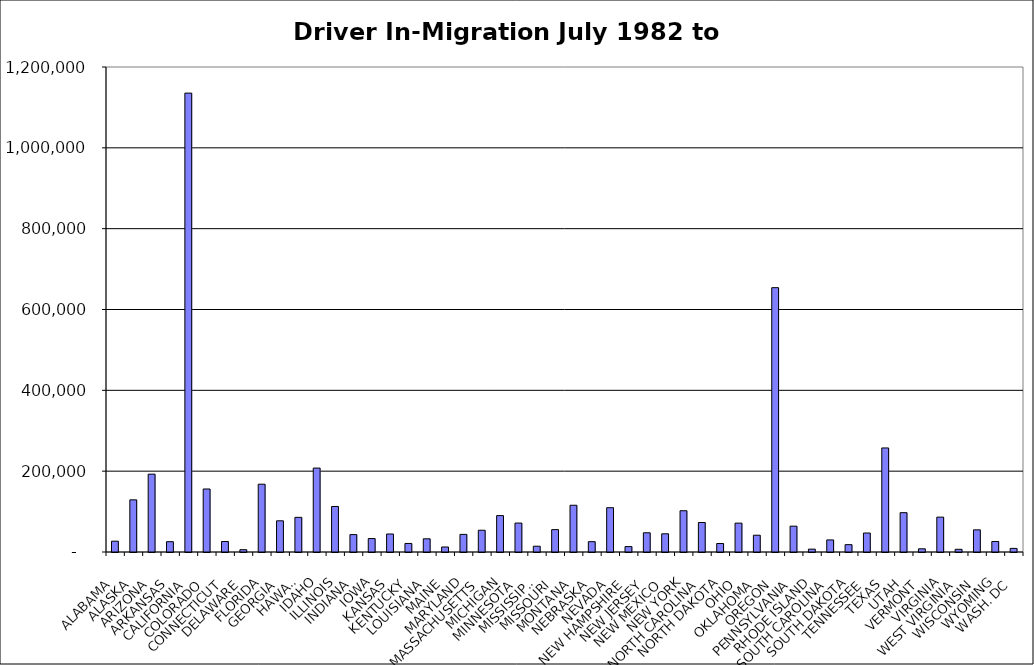
| Category | Series 0 |
|---|---|
| ALABAMA | 26725.5 |
| ALASKA | 129039.5 |
| ARIZONA | 192633 |
| ARKANSAS | 25525.5 |
| CALIFORNIA | 1135375.5 |
| COLORADO | 155894 |
| CONNECTICUT | 25974 |
| DELAWARE | 5707.5 |
| FLORIDA | 167730 |
| GEORGIA | 77190 |
| HAWAII | 85713.5 |
| IDAHO | 207676.5 |
| ILLINOIS | 112683.5 |
| INDIANA | 43066 |
| IOWA | 33222.5 |
| KANSAS | 44506.5 |
| KENTUCKY | 21128 |
| LOUISIANA | 32654.5 |
| MAINE | 12395.5 |
| MARYLAND | 43606 |
| MASSACHUSETTS | 53827 |
| MICHIGAN | 90055 |
| MINNESOTA | 71593.5 |
| MISSISSIPPI | 14270 |
| MISSOURI | 55364 |
| MONTANA | 115655 |
| NEBRASKA | 25555.5 |
| NEVADA | 109608 |
| NEW HAMPSHIRE | 13390.5 |
| NEW JERSEY | 47586 |
| NEW MEXICO | 45037 |
| NEW YORK | 102081 |
| NORTH CAROLINA | 72987.5 |
| NORTH DAKOTA | 21050.5 |
| OHIO | 71406.5 |
| OKLAHOMA | 41517 |
| OREGON | 654032 |
| PENNSYLVANIA | 63910.5 |
| RHODE ISLAND | 7075 |
| SOUTH CAROLINA | 29873.5 |
| SOUTH DAKOTA | 18203.5 |
| TENNESSEE | 46954.5 |
| TEXAS | 257466 |
| UTAH | 97292.5 |
| VERMONT | 7899 |
| VIRGINIA | 86285 |
| WEST VIRGINIA | 6685.5 |
| WISCONSIN | 54797.5 |
| WYOMING | 25983 |
| WASH. DC | 8915 |